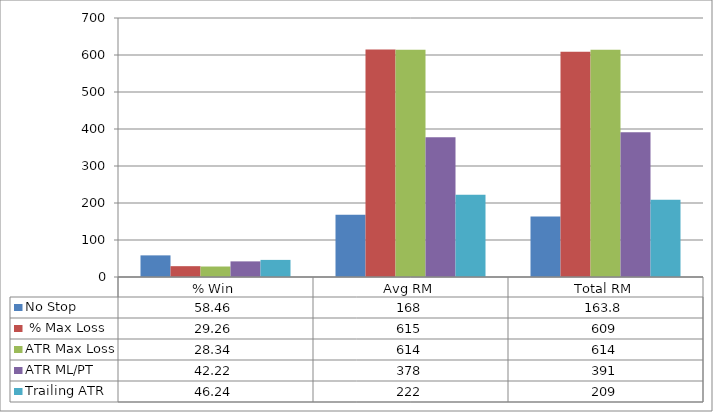
| Category | No Stop |  % Max Loss | ATR Max Loss | ATR ML/PT | Trailing ATR |
|---|---|---|---|---|---|
| % Win | 58.46 | 29.26 | 28.34 | 42.22 | 46.24 |
| Avg RM | 168 | 615 | 614 | 378 | 222 |
| Total RM | 163.8 | 609 | 614 | 391 | 209 |